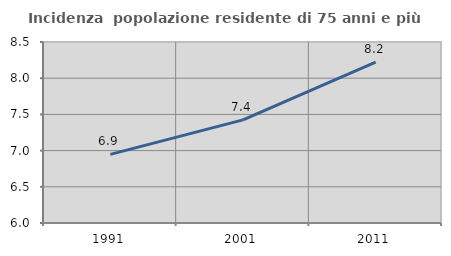
| Category | Incidenza  popolazione residente di 75 anni e più |
|---|---|
| 1991.0 | 6.948 |
| 2001.0 | 7.425 |
| 2011.0 | 8.223 |